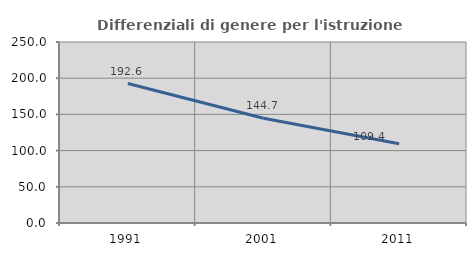
| Category | Differenziali di genere per l'istruzione superiore |
|---|---|
| 1991.0 | 192.593 |
| 2001.0 | 144.703 |
| 2011.0 | 109.375 |